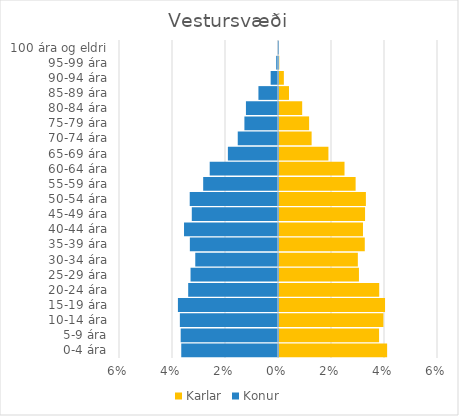
| Category | Karlar | Konur |
|---|---|---|
| 0-4 ára | 0.041 | -0.037 |
| 5-9 ára | 0.038 | -0.037 |
| 10-14 ára | 0.039 | -0.037 |
| 15-19 ára | 0.04 | -0.038 |
| 20-24 ára | 0.038 | -0.034 |
| 25-29 ára | 0.03 | -0.033 |
| 30-34 ára | 0.03 | -0.031 |
| 35-39 ára | 0.032 | -0.033 |
| 40-44 ára | 0.032 | -0.035 |
| 45-49 ára | 0.032 | -0.033 |
| 50-54 ára | 0.033 | -0.033 |
| 55-59 ára | 0.029 | -0.028 |
| 60-64 ára | 0.025 | -0.026 |
| 65-69 ára | 0.019 | -0.019 |
| 70-74 ára | 0.012 | -0.015 |
| 75-79 ára | 0.011 | -0.013 |
| 80-84 ára | 0.009 | -0.012 |
| 85-89 ára | 0.004 | -0.007 |
| 90-94 ára | 0.002 | -0.003 |
| 95-99 ára | 0 | -0.001 |
| 100 ára og eldri | 0 | 0 |